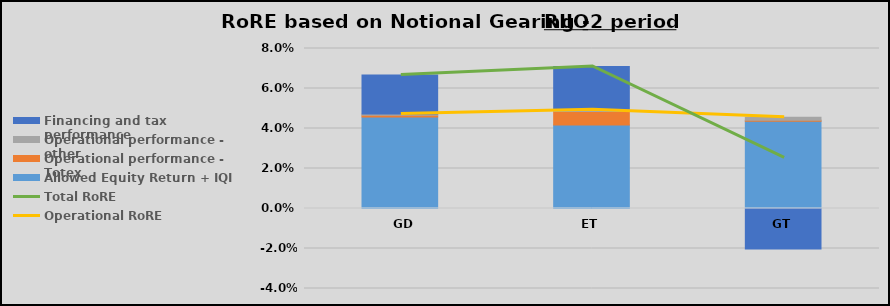
| Category | Allowed Equity Return + IQI | Operational performance - Totex | Operational performance - other | Financing and tax performance |
|---|---|---|---|---|
| GD | 0.046 | 0.001 | 0.001 | 0.02 |
| ET | 0.042 | 0.007 | 0.001 | 0.022 |
| GT | 0.044 | 0.001 | 0.001 | -0.02 |